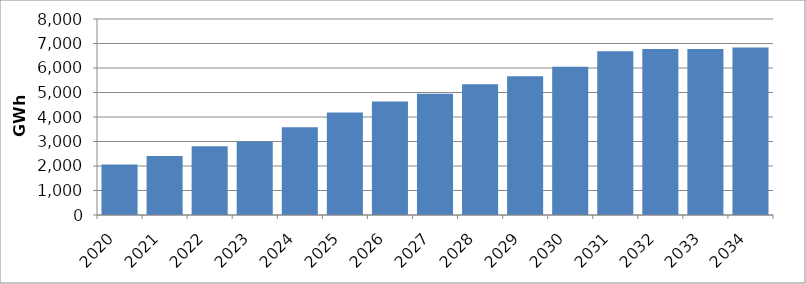
| Category | PacifiCorp System |
|---|---|
| 2020.0 | 2063.588 |
| 2021.0 | 2403.841 |
| 2022.0 | 2803.389 |
| 2023.0 | 3001.678 |
| 2024.0 | 3584.063 |
| 2025.0 | 4187.318 |
| 2026.0 | 4637.361 |
| 2027.0 | 4947.58 |
| 2028.0 | 5333.564 |
| 2029.0 | 5662.092 |
| 2030.0 | 6049.959 |
| 2031.0 | 6682.535 |
| 2032.0 | 6771.483 |
| 2033.0 | 6773.54 |
| 2034.0 | 6841.588 |